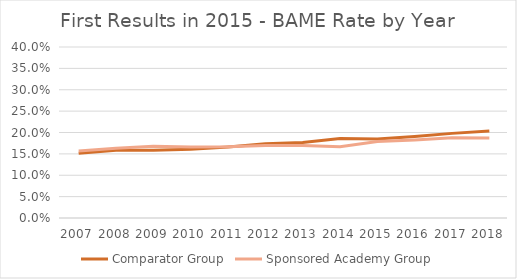
| Category | Comparator Group | Sponsored Academy Group |
|---|---|---|
| 2007.0 | 0.152 | 0.156 |
| 2008.0 | 0.159 | 0.163 |
| 2009.0 | 0.159 | 0.168 |
| 2010.0 | 0.161 | 0.166 |
| 2011.0 | 0.166 | 0.167 |
| 2012.0 | 0.174 | 0.17 |
| 2013.0 | 0.177 | 0.17 |
| 2014.0 | 0.186 | 0.167 |
| 2015.0 | 0.185 | 0.179 |
| 2016.0 | 0.191 | 0.183 |
| 2017.0 | 0.198 | 0.188 |
| 2018.0 | 0.204 | 0.187 |